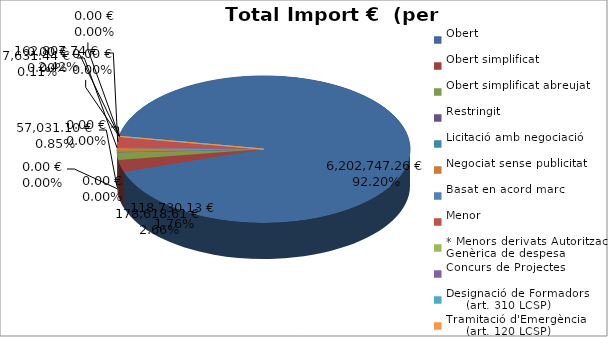
| Category | Total preu
(amb IVA) |
|---|---|
| Obert | 6202747.26 |
| Obert simplificat | 178618.61 |
| Obert simplificat abreujat | 118730.13 |
| Restringit | 0 |
| Licitació amb negociació | 0 |
| Negociat sense publicitat | 57031.1 |
| Basat en acord marc | 7631.44 |
| Menor | 162807.74 |
| * Menors derivats Autorització Genèrica de despesa | 0 |
| Concurs de Projectes | 0 |
| Designació de Formadors
     (art. 310 LCSP) | 0 |
| Tramitació d'Emergència
     (art. 120 LCSP) | 0 |